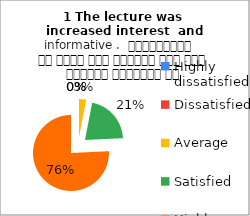
| Category | 1 The lecture was  increased interest  and informative .  व्याख्यान से रुचि में वृद्धि हुई एवं शिक्षण जानकारी से परिपूर्ण था |
|---|---|
| Highly dissatisfied | 0 |
| Dissatisfied | 0 |
| Average | 1 |
| Satisfied | 7 |
| Highly satisfied | 25 |